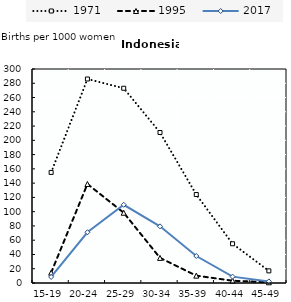
| Category | 1971 | 1995 | 2017 |
|---|---|---|---|
| 15-19 | 155 | 14.5 | 8.49 |
| 20-24 | 286 | 138.8 | 71.13 |
| 25-29 | 273 | 98.5 | 109.66 |
| 30-34 | 211 | 35.2 | 79.43 |
| 35-39 | 124 | 10.3 | 37.85 |
| 40-44 | 55 | 3.2 | 8.91 |
| 45-49 | 17 | 1 | 2.22 |